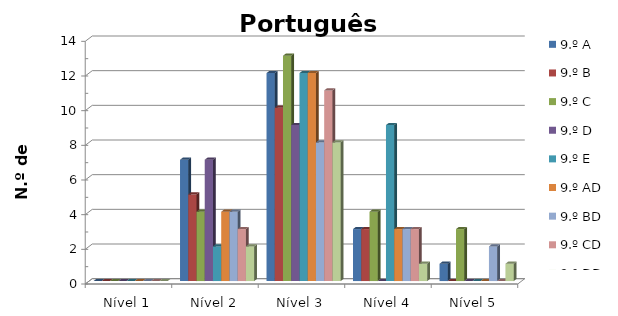
| Category | 9.º A | 9.º B | 9.º C | 9.º D | 9.º E | 9.º AD | 9.º BD | 9.º CD | 9.º DD |
|---|---|---|---|---|---|---|---|---|---|
| Nível 1 | 0 | 0 | 0 | 0 | 0 | 0 | 0 | 0 | 0 |
| Nível 2 | 7 | 5 | 4 | 7 | 2 | 4 | 4 | 3 | 2 |
| Nível 3 | 12 | 10 | 13 | 9 | 12 | 12 | 8 | 11 | 8 |
| Nível 4 | 3 | 3 | 4 | 0 | 9 | 3 | 3 | 3 | 1 |
| Nível 5 | 1 | 0 | 3 | 0 | 0 | 0 | 2 | 0 | 1 |